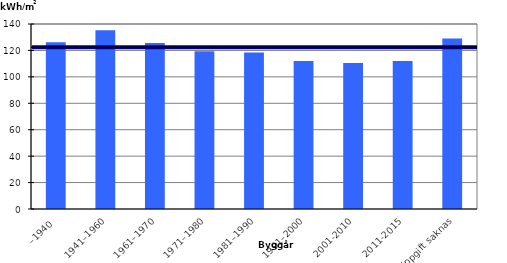
| Category | Genomsnitt per byggår (KWh/m2) |
|---|---|
| –1940 | 126.219 |
| 1941–1960 | 135.28 |
| 1961–1970 | 125.695 |
| 1971–1980 | 119.422 |
| 1981–1990 | 118.429 |
| 1991–2000 | 111.965 |
| 2001-2010 | 110.444 |
| 2011-2015 | 112.023 |
| Uppgift saknas | 128.966 |